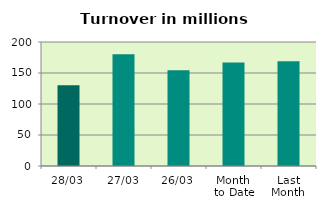
| Category | Series 0 |
|---|---|
| 28/03 | 130.105 |
| 27/03 | 180.295 |
| 26/03 | 154.281 |
| Month 
to Date | 166.953 |
| Last
Month | 168.971 |